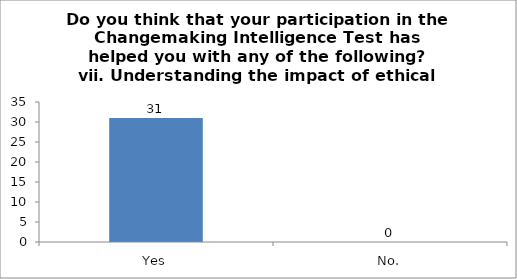
| Category | Do you think that your participation in the Changemaking Intelligence Test has helped you with any of the following?
vii. Understanding the impact of ethical choices. |
|---|---|
| Yes | 31 |
| No. | 0 |